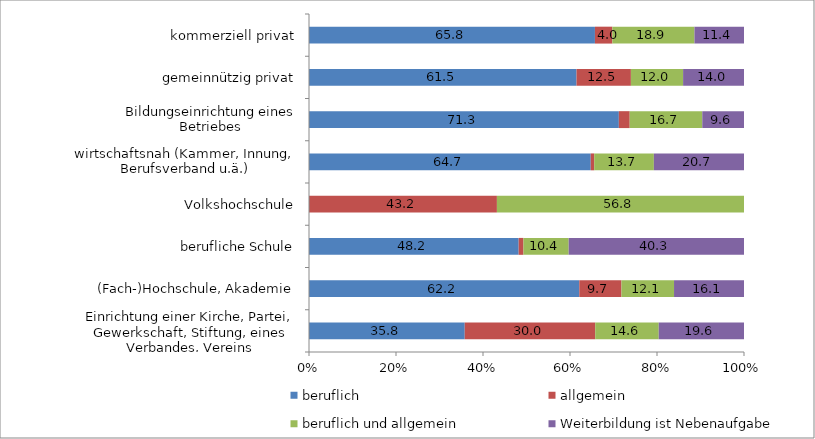
| Category | beruflich | allgemein | beruflich und allgemein | Weiterbildung ist Nebenaufgabe |
|---|---|---|---|---|
| Einrichtung einer Kirche, Partei, Gewerkschaft, Stiftung, eines Verbandes, Vereins | 35.8 | 30 | 14.6 | 19.6 |
| (Fach-)Hochschule, Akademie | 62.2 | 9.7 | 12.1 | 16.1 |
| berufliche Schule | 48.2 | 1.1 | 10.4 | 40.3 |
| Volkshochschule | 0 | 43.2 | 56.8 | 0 |
| wirtschaftsnah (Kammer, Innung, Berufsverband u.ä.) | 64.7 | 0.8 | 13.7 | 20.7 |
| Bildungseinrichtung eines Betriebes | 71.3 | 2.5 | 16.7 | 9.6 |
| gemeinnützig privat | 61.5 | 12.5 | 12 | 14 |
| kommerziell privat | 65.8 | 4 | 18.9 | 11.4 |